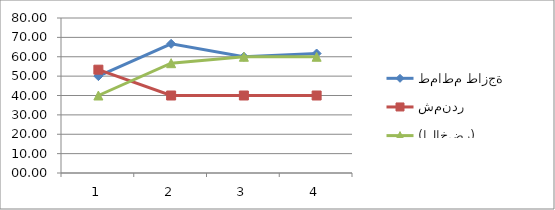
| Category | طماطم طازجة | شمندر | الثوم المحلي (الاخضر) |
|---|---|---|---|
| 0 | 50 | 53.33 | 40 |
| 1 | 66.67 | 40 | 56.67 |
| 2 | 60 | 40 | 60 |
| 3 | 61.67 | 40 | 60 |